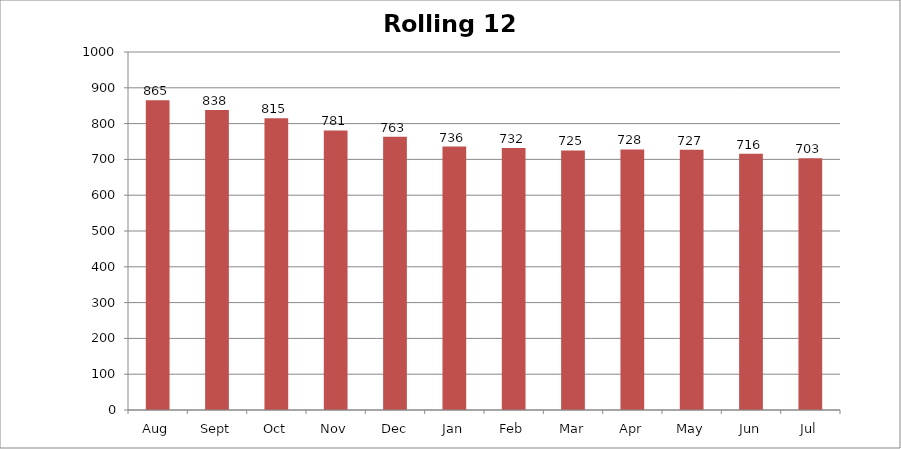
| Category | Rolling 12 Month |
|---|---|
| Aug | 865 |
| Sept | 838 |
| Oct | 815 |
| Nov | 781 |
| Dec | 763 |
| Jan | 736 |
| Feb | 732 |
| Mar | 725 |
| Apr | 728 |
| May | 727 |
| Jun | 716 |
| Jul | 703 |